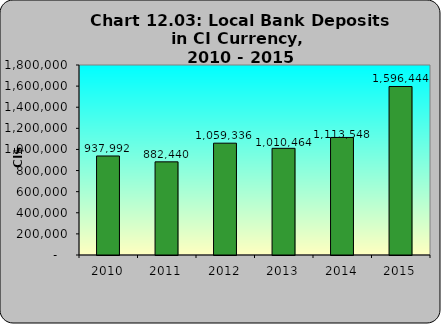
| Category | All Deposits |
|---|---|
| 2010.0 | 937992 |
| 2011.0 | 882440 |
| 2012.0 | 1059336 |
| 2013.0 | 1010464 |
| 2014.0 | 1113548 |
| 2015.0 | 1596444 |